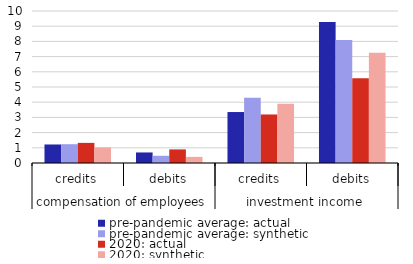
| Category | pre-pandemic average: actual  | pre-pandemic average: synthetic | 2020: actual | 2020: synthetic |
|---|---|---|---|---|
| 0 | 1.218 | 1.237 | 1.323 | 1.023 |
| 1 | 0.694 | 0.474 | 0.894 | 0.401 |
| 2 | 3.353 | 4.288 | 3.192 | 3.901 |
| 3 | 9.274 | 8.099 | 5.572 | 7.259 |